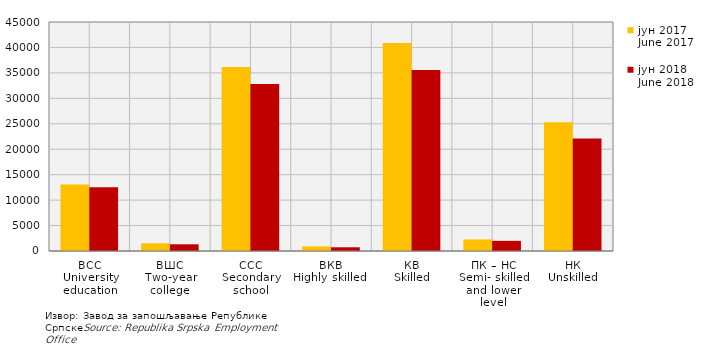
| Category | јун 2017
June 2017 | јун 2018
June 2018 |
|---|---|---|
| ВСС
University education | 13056 | 12516 |
| ВШС
Two-year college | 1526 | 1315 |
| ССС
Secondary school | 36152 | 32817 |
| ВКВ 
Highly skilled    | 884 | 732 |
| КВ
Skilled | 40859 | 35556 |
| ПК – НС
Semi- skilled and lower level | 2271 | 1994 |
| НК
Unskilled | 25288 | 22104 |